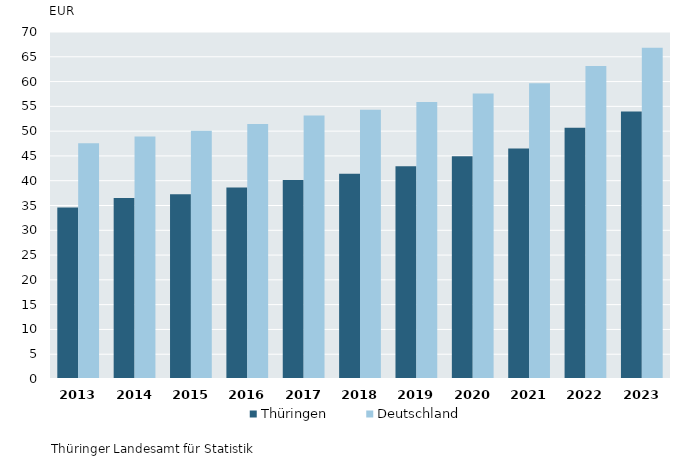
| Category | Thüringen | Deutschland |
|---|---|---|
| 2013.0 | 34.62 | 47.54 |
| 2014.0 | 36.53 | 48.93 |
| 2015.0 | 37.27 | 50.09 |
| 2016.0 | 38.64 | 51.45 |
| 2017.0 | 40.16 | 53.15 |
| 2018.0 | 41.38 | 54.33 |
| 2019.0 | 42.94 | 55.88 |
| 2020.0 | 44.95 | 57.59 |
| 2021.0 | 46.5 | 59.67 |
| 2022.0 | 50.66 | 63.13 |
| 2023.0 | 53.97 | 66.84 |